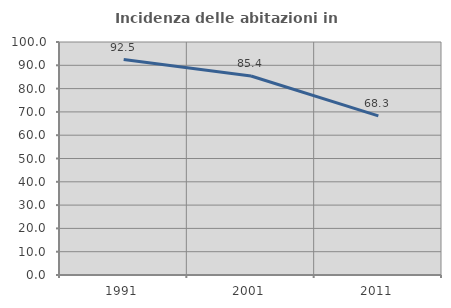
| Category | Incidenza delle abitazioni in proprietà  |
|---|---|
| 1991.0 | 92.453 |
| 2001.0 | 85.417 |
| 2011.0 | 68.293 |